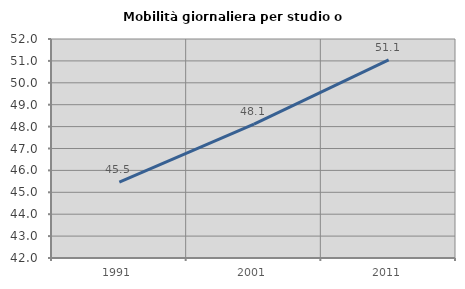
| Category | Mobilità giornaliera per studio o lavoro |
|---|---|
| 1991.0 | 45.47 |
| 2001.0 | 48.117 |
| 2011.0 | 51.051 |